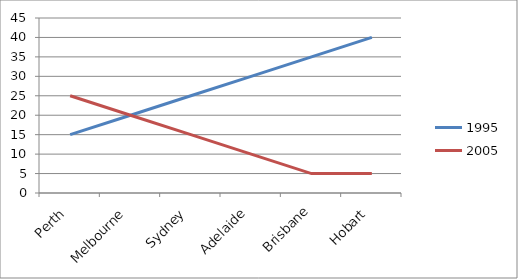
| Category | 1995 | 2005 |
|---|---|---|
| Perth | 15 | 25 |
| Melbourne | 20 | 20 |
| Sydney | 25 | 15 |
| Adelaide | 30 | 10 |
| Brisbane | 35 | 5 |
| Hobart | 40 | 5 |